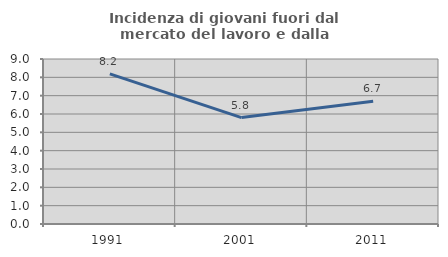
| Category | Incidenza di giovani fuori dal mercato del lavoro e dalla formazione  |
|---|---|
| 1991.0 | 8.186 |
| 2001.0 | 5.804 |
| 2011.0 | 6.699 |